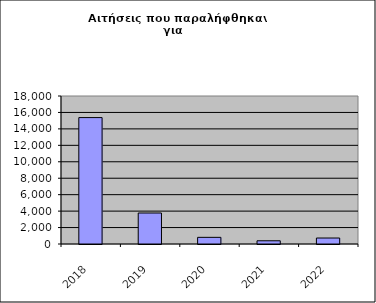
| Category | Series 0 |
|---|---|
| 2018.0 | 15375 |
| 2019.0 | 3769 |
| 2020.0 | 809 |
| 2021.0 | 391 |
| 2022.0 | 727 |